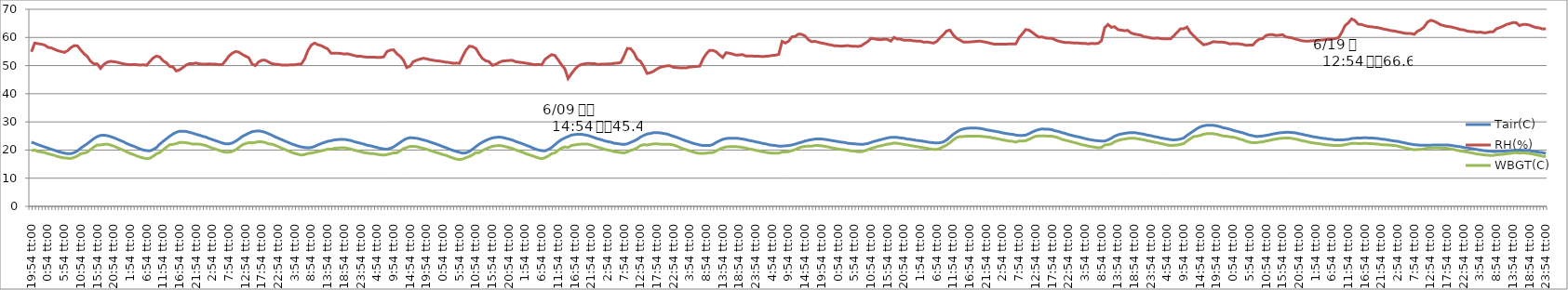
| Category | Tair(C) | RH(%) | WBGT(C) |
|---|---|---|---|
| 0.8291666666666666 | 22.8 | 54.9 | 19.8 |
| 0.8708333333333332 | 22.4 | 58 | 20 |
| 0.9125 | 21.9 | 57.8 | 19.5 |
| 0.9541666666666666 | 21.5 | 57.6 | 19.3 |
| 0.9958333333333332 | 21.1 | 57.3 | 19.1 |
| 0.0375 | 20.7 | 56.5 | 18.7 |
| 0.07916666666666666 | 20.3 | 56.3 | 18.4 |
| 0.12083333333333333 | 19.9 | 55.8 | 18.1 |
| 0.1625 | 19.5 | 55.3 | 17.7 |
| 0.2041666666666667 | 19.2 | 55 | 17.4 |
| 0.24583333333333335 | 18.9 | 54.7 | 17.2 |
| 0.28750000000000003 | 18.7 | 55.3 | 17.1 |
| 0.32916666666666666 | 18.7 | 56.4 | 17 |
| 0.37083333333333335 | 19.1 | 57.1 | 17.4 |
| 0.41250000000000003 | 19.7 | 57 | 17.9 |
| 0.45416666666666666 | 20.7 | 55.5 | 18.7 |
| 0.49583333333333335 | 21.5 | 54.2 | 18.9 |
| 0.5375 | 22.3 | 53.2 | 19.3 |
| 0.5791666666666667 | 23.2 | 51.5 | 20.2 |
| 0.6208333333333333 | 24.1 | 50.6 | 21.1 |
| 0.6625 | 24.8 | 50.6 | 21.8 |
| 0.7041666666666666 | 25.2 | 49 | 21.8 |
| 0.7458333333333332 | 25.3 | 50.4 | 22 |
| 0.7875 | 25.1 | 51.2 | 22.1 |
| 0.8291666666666666 | 24.8 | 51.5 | 21.8 |
| 0.8708333333333332 | 24.4 | 51.4 | 21.4 |
| 0.9125 | 23.9 | 51.2 | 20.9 |
| 0.9541666666666666 | 23.4 | 50.9 | 20.4 |
| 0.9958333333333332 | 22.9 | 50.6 | 19.9 |
| 0.0375 | 22.3 | 50.4 | 19.3 |
| 0.07916666666666666 | 21.8 | 50.3 | 18.8 |
| 0.12083333333333333 | 21.4 | 50.4 | 18.4 |
| 0.1625 | 20.9 | 50.3 | 17.9 |
| 0.2041666666666667 | 20.4 | 50.2 | 17.5 |
| 0.24583333333333335 | 20 | 50.3 | 17.2 |
| 0.28750000000000003 | 19.8 | 50.1 | 16.9 |
| 0.32916666666666666 | 19.7 | 51.5 | 17.1 |
| 0.37083333333333335 | 20.2 | 52.7 | 17.8 |
| 0.41250000000000003 | 20.9 | 53.4 | 18.7 |
| 0.45416666666666666 | 22.1 | 53 | 19.1 |
| 0.49583333333333335 | 23.1 | 51.7 | 20.1 |
| 0.5375 | 24 | 51 | 21 |
| 0.5791666666666667 | 24.9 | 49.7 | 21.9 |
| 0.6208333333333333 | 25.7 | 49.5 | 22 |
| 0.6625 | 26.3 | 48.1 | 22.3 |
| 0.7041666666666666 | 26.7 | 48.5 | 22.7 |
| 0.7458333333333332 | 26.7 | 49.3 | 22.7 |
| 0.7875 | 26.6 | 50.2 | 22.6 |
| 0.8291666666666666 | 26.3 | 50.7 | 22.4 |
| 0.8708333333333332 | 26 | 50.7 | 22.1 |
| 0.9125 | 25.6 | 50.9 | 22.1 |
| 0.9541666666666666 | 25.3 | 50.6 | 22.1 |
| 0.9958333333333332 | 24.9 | 50.5 | 21.9 |
| 0.0375 | 24.6 | 50.5 | 21.6 |
| 0.07916666666666666 | 24.1 | 50.6 | 21.1 |
| 0.12083333333333333 | 23.7 | 50.5 | 20.7 |
| 0.1625 | 23.3 | 50.5 | 20.3 |
| 0.2041666666666667 | 22.9 | 50.3 | 19.9 |
| 0.24583333333333335 | 22.5 | 50.4 | 19.5 |
| 0.28750000000000003 | 22.2 | 51.8 | 19.2 |
| 0.32916666666666666 | 22.2 | 53.4 | 19.2 |
| 0.37083333333333335 | 22.5 | 54.4 | 19.5 |
| 0.41250000000000003 | 23.1 | 55 | 20.1 |
| 0.45416666666666666 | 23.9 | 54.8 | 20.9 |
| 0.49583333333333335 | 24.8 | 54 | 21.8 |
| 0.5375 | 25.4 | 53.4 | 22.3 |
| 0.5791666666666667 | 26 | 52.8 | 22.6 |
| 0.6208333333333333 | 26.5 | 50.6 | 22.6 |
| 0.6625 | 26.7 | 50 | 22.7 |
| 0.7041666666666666 | 26.8 | 51.3 | 23 |
| 0.7458333333333332 | 26.6 | 51.9 | 22.9 |
| 0.7875 | 26.3 | 51.9 | 22.7 |
| 0.8291666666666666 | 25.8 | 51.3 | 22.2 |
| 0.8708333333333332 | 25.3 | 50.7 | 22.1 |
| 0.9125 | 24.7 | 50.5 | 21.7 |
| 0.9541666666666666 | 24.2 | 50.4 | 21.2 |
| 0.9958333333333332 | 23.7 | 50.2 | 20.7 |
| 0.0375 | 23.2 | 50.2 | 20.2 |
| 0.07916666666666666 | 22.7 | 50.2 | 19.7 |
| 0.12083333333333333 | 22.2 | 50.3 | 19.2 |
| 0.1625 | 21.8 | 50.3 | 18.8 |
| 0.2041666666666667 | 21.4 | 50.5 | 18.5 |
| 0.24583333333333335 | 21.1 | 50.6 | 18.2 |
| 0.28750000000000003 | 20.9 | 52.4 | 18.4 |
| 0.32916666666666666 | 20.8 | 55.4 | 18.8 |
| 0.37083333333333335 | 20.9 | 57.3 | 18.9 |
| 0.41250000000000003 | 21.3 | 58 | 19.2 |
| 0.45416666666666666 | 21.8 | 57.4 | 19.4 |
| 0.49583333333333335 | 22.3 | 57.1 | 19.7 |
| 0.5375 | 22.7 | 56.5 | 20 |
| 0.5791666666666667 | 23.1 | 55.9 | 20.3 |
| 0.6208333333333333 | 23.3 | 54.4 | 20.3 |
| 0.6625 | 23.6 | 54.4 | 20.6 |
| 0.7041666666666666 | 23.7 | 54.4 | 20.7 |
| 0.7458333333333332 | 23.8 | 54.3 | 20.8 |
| 0.7875 | 23.8 | 54.1 | 20.8 |
| 0.8291666666666666 | 23.6 | 54.2 | 20.6 |
| 0.8708333333333332 | 23.4 | 53.9 | 20.4 |
| 0.9125 | 23 | 53.6 | 20 |
| 0.9541666666666666 | 22.7 | 53.3 | 19.7 |
| 0.9958333333333332 | 22.4 | 53.3 | 19.4 |
| 0.0375 | 22.1 | 53.1 | 19.1 |
| 0.07916666666666666 | 21.7 | 53 | 18.9 |
| 0.12083333333333333 | 21.5 | 53 | 18.8 |
| 0.1625 | 21.2 | 53 | 18.7 |
| 0.2041666666666667 | 20.9 | 52.9 | 18.5 |
| 0.24583333333333335 | 20.6 | 52.9 | 18.3 |
| 0.28750000000000003 | 20.4 | 53.1 | 18.2 |
| 0.32916666666666666 | 20.3 | 55 | 18.4 |
| 0.37083333333333335 | 20.6 | 55.5 | 18.7 |
| 0.41250000000000003 | 21.1 | 55.6 | 19 |
| 0.45416666666666666 | 21.9 | 54.2 | 19 |
| 0.49583333333333335 | 22.7 | 53.3 | 19.7 |
| 0.5375 | 23.5 | 51.9 | 20.5 |
| 0.5791666666666667 | 24.1 | 49.3 | 20.9 |
| 0.6208333333333333 | 24.4 | 49.8 | 21.3 |
| 0.6625 | 24.3 | 51.4 | 21.3 |
| 0.7041666666666666 | 24.2 | 51.9 | 21.2 |
| 0.7458333333333332 | 23.9 | 52.3 | 20.9 |
| 0.7875 | 23.6 | 52.6 | 20.6 |
| 0.8291666666666666 | 23.3 | 52.4 | 20.3 |
| 0.8708333333333332 | 22.9 | 52.1 | 19.9 |
| 0.9125 | 22.5 | 51.9 | 19.5 |
| 0.9541666666666666 | 22.1 | 51.7 | 19.1 |
| 0.9958333333333332 | 21.7 | 51.6 | 18.8 |
| 0.0375 | 21.2 | 51.4 | 18.4 |
| 0.07916666666666666 | 20.8 | 51.2 | 18.1 |
| 0.12083333333333333 | 20.3 | 51.1 | 17.6 |
| 0.1625 | 19.9 | 50.8 | 17.2 |
| 0.2041666666666667 | 19.5 | 50.9 | 16.8 |
| 0.24583333333333335 | 19.2 | 50.8 | 16.6 |
| 0.28750000000000003 | 18.9 | 53.3 | 16.8 |
| 0.32916666666666666 | 19 | 55.5 | 17.3 |
| 0.37083333333333335 | 19.5 | 56.9 | 17.7 |
| 0.41250000000000003 | 20.3 | 56.7 | 18.3 |
| 0.45416666666666666 | 21.2 | 56.1 | 19.1 |
| 0.49583333333333335 | 22.1 | 54.1 | 19.1 |
| 0.5375 | 22.8 | 52.5 | 19.8 |
| 0.5791666666666667 | 23.4 | 51.7 | 20.4 |
| 0.6208333333333333 | 23.9 | 51.4 | 20.9 |
| 0.6625 | 24.3 | 50.1 | 21.3 |
| 0.7041666666666666 | 24.5 | 50.4 | 21.5 |
| 0.7458333333333332 | 24.6 | 51.1 | 21.6 |
| 0.7875 | 24.5 | 51.6 | 21.5 |
| 0.8291666666666666 | 24.2 | 51.7 | 21.2 |
| 0.8708333333333332 | 23.9 | 51.8 | 20.9 |
| 0.9125 | 23.6 | 51.9 | 20.6 |
| 0.9541666666666666 | 23.1 | 51.4 | 20.1 |
| 0.9958333333333332 | 22.7 | 51.2 | 19.7 |
| 0.0375 | 22.3 | 51.1 | 19.3 |
| 0.07916666666666666 | 21.8 | 50.9 | 18.8 |
| 0.12083333333333333 | 21.4 | 50.7 | 18.4 |
| 0.1625 | 20.9 | 50.5 | 18 |
| 0.2041666666666667 | 20.4 | 50.3 | 17.6 |
| 0.24583333333333335 | 20 | 50.4 | 17.2 |
| 0.28750000000000003 | 19.8 | 50.3 | 16.9 |
| 0.32916666666666666 | 19.7 | 52.2 | 17.3 |
| 0.37083333333333335 | 20.2 | 53.1 | 17.9 |
| 0.41250000000000003 | 20.9 | 53.9 | 18.7 |
| 0.45416666666666666 | 21.9 | 53.6 | 19 |
| 0.49583333333333335 | 22.9 | 52 | 19.9 |
| 0.5375 | 23.7 | 50.3 | 20.7 |
| 0.5791666666666667 | 24.3 | 48.9 | 21.1 |
| 0.6208333333333333 | 24.8 | 45.4 | 20.9 |
| 0.6625 | 25.3 | 47.1 | 21.6 |
| 0.7041666666666666 | 25.5 | 48.6 | 21.8 |
| 0.7458333333333332 | 25.6 | 49.8 | 22 |
| 0.7875 | 25.6 | 50.4 | 22.1 |
| 0.8291666666666666 | 25.4 | 50.6 | 22.1 |
| 0.8708333333333332 | 25.2 | 50.8 | 22.1 |
| 0.9125 | 24.8 | 50.7 | 21.8 |
| 0.9541666666666666 | 24.4 | 50.7 | 21.4 |
| 0.9958333333333332 | 24 | 50.4 | 21 |
| 0.0375 | 23.7 | 50.5 | 20.7 |
| 0.07916666666666666 | 23.3 | 50.5 | 20.3 |
| 0.12083333333333333 | 23 | 50.6 | 20 |
| 0.1625 | 22.8 | 50.6 | 19.8 |
| 0.2041666666666667 | 22.4 | 50.8 | 19.4 |
| 0.24583333333333335 | 22.3 | 50.9 | 19.3 |
| 0.28750000000000003 | 22.1 | 51.1 | 19.1 |
| 0.32916666666666666 | 22 | 53.4 | 19 |
| 0.37083333333333335 | 22.2 | 56.1 | 19.3 |
| 0.41250000000000003 | 22.7 | 56 | 19.9 |
| 0.45416666666666666 | 23.2 | 54.6 | 20.2 |
| 0.49583333333333335 | 23.8 | 52.3 | 20.8 |
| 0.5375 | 24.6 | 51.5 | 21.6 |
| 0.5791666666666667 | 25.2 | 49.6 | 21.9 |
| 0.6208333333333333 | 25.7 | 47.2 | 21.8 |
| 0.6625 | 25.9 | 47.5 | 22 |
| 0.7041666666666666 | 26.2 | 48 | 22.2 |
| 0.7458333333333332 | 26.2 | 48.8 | 22.2 |
| 0.7875 | 26.1 | 49.4 | 22.1 |
| 0.8291666666666666 | 25.9 | 49.7 | 22 |
| 0.8708333333333332 | 25.7 | 49.9 | 22 |
| 0.9125 | 25.3 | 49.9 | 22 |
| 0.9541666666666666 | 24.9 | 49.4 | 21.8 |
| 0.9958333333333332 | 24.5 | 49.3 | 21.4 |
| 0.0375 | 24.1 | 49.2 | 20.9 |
| 0.07916666666666666 | 23.6 | 49.2 | 20.4 |
| 0.12083333333333333 | 23.2 | 49.2 | 20.1 |
| 0.1625 | 22.8 | 49.5 | 19.7 |
| 0.2041666666666667 | 22.4 | 49.6 | 19.3 |
| 0.24583333333333335 | 22.1 | 49.7 | 19 |
| 0.28750000000000003 | 21.8 | 49.8 | 18.8 |
| 0.32916666666666666 | 21.6 | 52.4 | 18.8 |
| 0.37083333333333335 | 21.6 | 54.2 | 18.9 |
| 0.41250000000000003 | 21.6 | 55.4 | 19.1 |
| 0.45416666666666666 | 22 | 55.4 | 19.1 |
| 0.49583333333333335 | 22.7 | 54.9 | 19.7 |
| 0.5375 | 23.3 | 53.8 | 20.3 |
| 0.5791666666666667 | 23.8 | 52.9 | 20.8 |
| 0.6208333333333333 | 24.1 | 54.6 | 21.1 |
| 0.6625 | 24.2 | 54.4 | 21.2 |
| 0.7041666666666666 | 24.2 | 54.1 | 21.2 |
| 0.7458333333333332 | 24.2 | 53.7 | 21.2 |
| 0.7875 | 24.1 | 53.8 | 21.1 |
| 0.8291666666666666 | 23.9 | 53.9 | 20.9 |
| 0.8708333333333332 | 23.7 | 53.4 | 20.7 |
| 0.9125 | 23.4 | 53.4 | 20.4 |
| 0.9541666666666666 | 23.2 | 53.4 | 20.2 |
| 0.9958333333333332 | 22.9 | 53.3 | 19.9 |
| 0.0375 | 22.7 | 53.3 | 19.7 |
| 0.07916666666666666 | 22.4 | 53.2 | 19.4 |
| 0.12083333333333333 | 22.2 | 53.3 | 19.2 |
| 0.1625 | 21.9 | 53.4 | 19 |
| 0.2041666666666667 | 21.7 | 53.6 | 18.9 |
| 0.24583333333333335 | 21.6 | 53.7 | 18.9 |
| 0.28750000000000003 | 21.4 | 54 | 18.9 |
| 0.32916666666666666 | 21.4 | 58.6 | 19.3 |
| 0.37083333333333335 | 21.5 | 58 | 19.3 |
| 0.41250000000000003 | 21.6 | 58.7 | 19.4 |
| 0.45416666666666666 | 21.8 | 60.2 | 19.8 |
| 0.49583333333333335 | 22.1 | 60.4 | 20.2 |
| 0.5375 | 22.5 | 61.2 | 20.7 |
| 0.5791666666666667 | 22.8 | 61.1 | 21.1 |
| 0.6208333333333333 | 23.2 | 60.5 | 21.3 |
| 0.6625 | 23.5 | 59.2 | 21.4 |
| 0.7041666666666666 | 23.7 | 58.5 | 21.4 |
| 0.7458333333333332 | 23.9 | 58.6 | 21.6 |
| 0.7875 | 23.9 | 58.3 | 21.6 |
| 0.8291666666666666 | 23.9 | 58 | 21.5 |
| 0.8708333333333332 | 23.8 | 57.8 | 21.3 |
| 0.9125 | 23.6 | 57.5 | 21.1 |
| 0.9541666666666666 | 23.4 | 57.3 | 20.8 |
| 0.9958333333333332 | 23.2 | 57 | 20.6 |
| 0.0375 | 23 | 57 | 20.4 |
| 0.07916666666666666 | 22.8 | 56.9 | 20.2 |
| 0.12083333333333333 | 22.7 | 57 | 20.1 |
| 0.1625 | 22.4 | 57.1 | 19.9 |
| 0.2041666666666667 | 22.3 | 56.9 | 19.7 |
| 0.24583333333333335 | 22.2 | 56.9 | 19.6 |
| 0.28750000000000003 | 22.1 | 56.8 | 19.4 |
| 0.32916666666666666 | 22 | 57 | 19.4 |
| 0.37083333333333335 | 22.1 | 57.8 | 19.7 |
| 0.41250000000000003 | 22.3 | 58.5 | 20.1 |
| 0.45416666666666666 | 22.7 | 59.7 | 20.6 |
| 0.49583333333333335 | 23.1 | 59.5 | 20.9 |
| 0.5375 | 23.4 | 59.3 | 21.3 |
| 0.5791666666666667 | 23.7 | 59.2 | 21.5 |
| 0.6208333333333333 | 24 | 59.4 | 21.8 |
| 0.6625 | 24.3 | 59.3 | 22.1 |
| 0.7041666666666666 | 24.5 | 58.7 | 22.2 |
| 0.7458333333333332 | 24.5 | 60 | 22.5 |
| 0.7875 | 24.5 | 59.4 | 22.4 |
| 0.8291666666666666 | 24.3 | 59.4 | 22.2 |
| 0.8708333333333332 | 24.2 | 59 | 22 |
| 0.9125 | 23.9 | 59 | 21.8 |
| 0.9541666666666666 | 23.8 | 59 | 21.6 |
| 0.9958333333333332 | 23.6 | 58.8 | 21.4 |
| 0.0375 | 23.4 | 58.7 | 21.2 |
| 0.07916666666666666 | 23.3 | 58.7 | 21 |
| 0.12083333333333333 | 23.1 | 58.3 | 20.8 |
| 0.1625 | 22.9 | 58.4 | 20.6 |
| 0.2041666666666667 | 22.7 | 58.2 | 20.4 |
| 0.24583333333333335 | 22.6 | 58 | 20.2 |
| 0.28750000000000003 | 22.5 | 58.6 | 20.2 |
| 0.32916666666666666 | 22.6 | 59.9 | 20.6 |
| 0.37083333333333335 | 22.9 | 61 | 21.2 |
| 0.41250000000000003 | 23.6 | 62.3 | 21.8 |
| 0.45416666666666666 | 24.6 | 62.6 | 22.6 |
| 0.49583333333333335 | 25.6 | 60.9 | 23.6 |
| 0.5375 | 26.4 | 59.7 | 24.4 |
| 0.5791666666666667 | 27.1 | 59.1 | 24.8 |
| 0.6208333333333333 | 27.5 | 58.4 | 24.8 |
| 0.6625 | 27.7 | 58.4 | 24.9 |
| 0.7041666666666666 | 27.8 | 58.4 | 24.9 |
| 0.7458333333333332 | 27.8 | 58.5 | 24.9 |
| 0.7875 | 27.8 | 58.6 | 24.9 |
| 0.8291666666666666 | 27.7 | 58.7 | 24.9 |
| 0.8708333333333332 | 27.5 | 58.5 | 24.8 |
| 0.9125 | 27.2 | 58.3 | 24.7 |
| 0.9541666666666666 | 27 | 58 | 24.6 |
| 0.9958333333333332 | 26.8 | 57.7 | 24.3 |
| 0.0375 | 26.6 | 57.6 | 24.1 |
| 0.07916666666666666 | 26.4 | 57.6 | 23.9 |
| 0.12083333333333333 | 26.1 | 57.6 | 23.6 |
| 0.1625 | 25.9 | 57.6 | 23.4 |
| 0.2041666666666667 | 25.7 | 57.7 | 23.2 |
| 0.24583333333333335 | 25.6 | 57.7 | 23.1 |
| 0.28750000000000003 | 25.3 | 57.7 | 22.8 |
| 0.32916666666666666 | 25.2 | 60 | 23.2 |
| 0.37083333333333335 | 25.2 | 61.3 | 23.2 |
| 0.41250000000000003 | 25.3 | 62.8 | 23.3 |
| 0.45416666666666666 | 25.8 | 62.6 | 23.8 |
| 0.49583333333333335 | 26.4 | 61.8 | 24.4 |
| 0.5375 | 26.9 | 60.9 | 24.9 |
| 0.5791666666666667 | 27.3 | 60.1 | 25 |
| 0.6208333333333333 | 27.5 | 60.2 | 25 |
| 0.6625 | 27.4 | 59.8 | 25 |
| 0.7041666666666666 | 27.4 | 59.7 | 24.9 |
| 0.7458333333333332 | 27.2 | 59.7 | 24.9 |
| 0.7875 | 26.8 | 59.1 | 24.7 |
| 0.8291666666666666 | 26.6 | 58.7 | 24.3 |
| 0.8708333333333332 | 26.2 | 58.4 | 23.8 |
| 0.9125 | 25.9 | 58.2 | 23.5 |
| 0.9541666666666666 | 25.5 | 58.2 | 23.2 |
| 0.9958333333333332 | 25.2 | 58.1 | 22.9 |
| 0.0375 | 24.9 | 58 | 22.6 |
| 0.07916666666666666 | 24.7 | 58 | 22.3 |
| 0.12083333333333333 | 24.4 | 57.9 | 21.9 |
| 0.1625 | 24.1 | 57.9 | 21.7 |
| 0.2041666666666667 | 23.8 | 57.7 | 21.4 |
| 0.24583333333333335 | 23.6 | 57.9 | 21.2 |
| 0.28750000000000003 | 23.4 | 57.8 | 21 |
| 0.32916666666666666 | 23.3 | 57.9 | 20.8 |
| 0.37083333333333335 | 23.2 | 58.8 | 20.9 |
| 0.41250000000000003 | 23.2 | 63.5 | 21.8 |
| 0.45416666666666666 | 23.6 | 64.6 | 21.9 |
| 0.49583333333333335 | 24.2 | 63.6 | 22.2 |
| 0.5375 | 24.9 | 63.8 | 22.9 |
| 0.5791666666666667 | 25.4 | 62.8 | 23.4 |
| 0.6208333333333333 | 25.7 | 62.6 | 23.7 |
| 0.6625 | 25.9 | 62.4 | 23.9 |
| 0.7041666666666666 | 26.1 | 62.5 | 24.1 |
| 0.7458333333333332 | 26.2 | 61.6 | 24.2 |
| 0.7875 | 26.2 | 61.2 | 24.2 |
| 0.8291666666666666 | 26 | 61 | 24 |
| 0.8708333333333332 | 25.8 | 60.8 | 23.8 |
| 0.9125 | 25.6 | 60.2 | 23.6 |
| 0.9541666666666666 | 25.3 | 60.1 | 23.3 |
| 0.9958333333333332 | 25.1 | 59.8 | 23.1 |
| 0.0375 | 24.8 | 59.7 | 22.8 |
| 0.07916666666666666 | 24.6 | 59.8 | 22.6 |
| 0.12083333333333333 | 24.3 | 59.6 | 22.3 |
| 0.1625 | 24.1 | 59.5 | 22.1 |
| 0.2041666666666667 | 23.9 | 59.5 | 21.8 |
| 0.24583333333333335 | 23.7 | 59.5 | 21.6 |
| 0.28750000000000003 | 23.6 | 60.6 | 21.7 |
| 0.32916666666666666 | 23.7 | 61.8 | 21.8 |
| 0.37083333333333335 | 23.9 | 63.1 | 22 |
| 0.41250000000000003 | 24.3 | 63.1 | 22.3 |
| 0.45416666666666666 | 25.2 | 63.7 | 23.2 |
| 0.49583333333333335 | 26 | 61.8 | 24 |
| 0.5375 | 26.8 | 60.6 | 24.8 |
| 0.5791666666666667 | 27.6 | 59.4 | 24.9 |
| 0.6208333333333333 | 28.2 | 58.4 | 25.2 |
| 0.6625 | 28.6 | 57.4 | 25.6 |
| 0.7041666666666666 | 28.8 | 57.6 | 25.8 |
| 0.7458333333333332 | 28.8 | 58 | 25.8 |
| 0.7875 | 28.8 | 58.5 | 25.8 |
| 0.8291666666666666 | 28.6 | 58.4 | 25.6 |
| 0.8708333333333332 | 28.3 | 58.4 | 25.3 |
| 0.9125 | 27.9 | 58.3 | 25 |
| 0.9541666666666666 | 27.7 | 58.1 | 24.9 |
| 0.9958333333333332 | 27.4 | 57.7 | 24.7 |
| 0.0375 | 27 | 57.8 | 24.6 |
| 0.07916666666666666 | 26.7 | 57.8 | 24.3 |
| 0.12083333333333333 | 26.4 | 57.7 | 23.9 |
| 0.1625 | 26.1 | 57.5 | 23.6 |
| 0.2041666666666667 | 25.7 | 57.2 | 23.1 |
| 0.24583333333333335 | 25.3 | 57.3 | 22.8 |
| 0.28750000000000003 | 25.1 | 57.3 | 22.6 |
| 0.32916666666666666 | 24.8 | 58.6 | 22.6 |
| 0.37083333333333335 | 24.9 | 59.4 | 22.8 |
| 0.41250000000000003 | 25 | 59.6 | 22.9 |
| 0.45416666666666666 | 25.2 | 60.7 | 23.2 |
| 0.49583333333333335 | 25.4 | 61 | 23.4 |
| 0.5375 | 25.7 | 61 | 23.7 |
| 0.5791666666666667 | 25.9 | 60.7 | 23.9 |
| 0.6208333333333333 | 26.1 | 60.8 | 24.1 |
| 0.6625 | 26.2 | 61 | 24.2 |
| 0.7041666666666666 | 26.3 | 60.2 | 24.3 |
| 0.7458333333333332 | 26.3 | 60 | 24.3 |
| 0.7875 | 26.2 | 59.8 | 24.1 |
| 0.8291666666666666 | 26.1 | 59.4 | 23.9 |
| 0.8708333333333332 | 25.8 | 59.1 | 23.6 |
| 0.9125 | 25.6 | 58.8 | 23.3 |
| 0.9541666666666666 | 25.3 | 58.7 | 23.1 |
| 0.9958333333333332 | 25.1 | 58.7 | 22.8 |
| 0.0375 | 24.8 | 58.8 | 22.6 |
| 0.07916666666666666 | 24.6 | 58.9 | 22.4 |
| 0.12083333333333333 | 24.4 | 59 | 22.3 |
| 0.1625 | 24.2 | 59.1 | 22.1 |
| 0.2041666666666667 | 24.1 | 59.2 | 21.9 |
| 0.24583333333333335 | 23.9 | 59.4 | 21.8 |
| 0.28750000000000003 | 23.8 | 59.4 | 21.7 |
| 0.32916666666666666 | 23.6 | 59.6 | 21.6 |
| 0.37083333333333335 | 23.6 | 59.9 | 21.6 |
| 0.41250000000000003 | 23.6 | 61.8 | 21.7 |
| 0.45416666666666666 | 23.7 | 64.2 | 21.9 |
| 0.49583333333333335 | 23.8 | 65.2 | 22.1 |
| 0.5375 | 24.1 | 66.6 | 22.4 |
| 0.5791666666666667 | 24.2 | 66 | 22.4 |
| 0.6208333333333333 | 24.3 | 64.7 | 22.3 |
| 0.6625 | 24.3 | 64.6 | 22.3 |
| 0.7041666666666666 | 24.4 | 64.2 | 22.4 |
| 0.7458333333333332 | 24.3 | 63.9 | 22.3 |
| 0.7875 | 24.3 | 63.8 | 22.3 |
| 0.8291666666666666 | 24.2 | 63.6 | 22.2 |
| 0.8708333333333332 | 24.1 | 63.5 | 22.1 |
| 0.9125 | 23.9 | 63.2 | 21.9 |
| 0.9541666666666666 | 23.8 | 62.9 | 21.9 |
| 0.9958333333333332 | 23.6 | 62.7 | 21.8 |
| 0.0375 | 23.4 | 62.4 | 21.7 |
| 0.07916666666666666 | 23.2 | 62.3 | 21.6 |
| 0.12083333333333333 | 23.1 | 62 | 21.4 |
| 0.1625 | 22.8 | 61.8 | 21.1 |
| 0.2041666666666667 | 22.6 | 61.5 | 20.8 |
| 0.24583333333333335 | 22.3 | 61.4 | 20.6 |
| 0.28750000000000003 | 22.1 | 61.4 | 20.3 |
| 0.32916666666666666 | 21.9 | 61.1 | 20.1 |
| 0.37083333333333335 | 21.8 | 62.2 | 20.2 |
| 0.41250000000000003 | 21.7 | 62.8 | 20.2 |
| 0.45416666666666666 | 21.7 | 63.7 | 20.4 |
| 0.49583333333333335 | 21.7 | 65.4 | 20.7 |
| 0.5375 | 21.7 | 66.1 | 20.7 |
| 0.5791666666666667 | 21.8 | 65.8 | 20.8 |
| 0.6208333333333333 | 21.8 | 65.2 | 20.8 |
| 0.6625 | 21.8 | 64.5 | 20.7 |
| 0.7041666666666666 | 21.8 | 64.2 | 20.6 |
| 0.7458333333333332 | 21.8 | 63.9 | 20.6 |
| 0.7875 | 21.7 | 63.8 | 20.4 |
| 0.8291666666666666 | 21.5 | 63.5 | 20.2 |
| 0.8708333333333332 | 21.3 | 63.2 | 19.9 |
| 0.9125 | 21.2 | 62.8 | 19.7 |
| 0.9541666666666666 | 20.9 | 62.7 | 19.5 |
| 0.9958333333333332 | 20.8 | 62.3 | 19.3 |
| 0.0375 | 20.6 | 62.1 | 19.1 |
| 0.07916666666666666 | 20.4 | 62.1 | 18.9 |
| 0.12083333333333333 | 20.2 | 61.8 | 18.6 |
| 0.1625 | 20 | 61.9 | 18.5 |
| 0.2041666666666667 | 19.8 | 61.7 | 18.3 |
| 0.24583333333333335 | 19.7 | 61.7 | 18.2 |
| 0.28750000000000003 | 19.6 | 62 | 18.1 |
| 0.32916666666666666 | 19.5 | 62 | 18.1 |
| 0.37083333333333335 | 19.5 | 63.1 | 18.3 |
| 0.41250000000000003 | 19.6 | 63.5 | 18.4 |
| 0.45416666666666666 | 19.6 | 64 | 18.5 |
| 0.49583333333333335 | 19.7 | 64.6 | 18.7 |
| 0.5375 | 19.7 | 64.9 | 18.8 |
| 0.5791666666666667 | 19.9 | 65.3 | 19 |
| 0.6208333333333333 | 19.9 | 65.2 | 19.1 |
| 0.6625 | 20 | 64.2 | 18.9 |
| 0.7041666666666666 | 19.9 | 64.6 | 19 |
| 0.7458333333333332 | 19.9 | 64.6 | 18.9 |
| 0.7875 | 19.8 | 64.4 | 18.8 |
| 0.8291666666666666 | 19.6 | 63.9 | 18.6 |
| 0.8708333333333332 | 19.4 | 63.5 | 18.3 |
| 0.9125 | 19.2 | 63.4 | 18.1 |
| 0.9541666666666666 | 19.1 | 63 | 17.8 |
| 0.9958333333333332 | 18.8 | 63.1 | 17.7 |